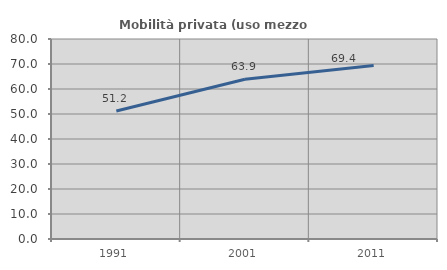
| Category | Mobilità privata (uso mezzo privato) |
|---|---|
| 1991.0 | 51.217 |
| 2001.0 | 63.87 |
| 2011.0 | 69.37 |